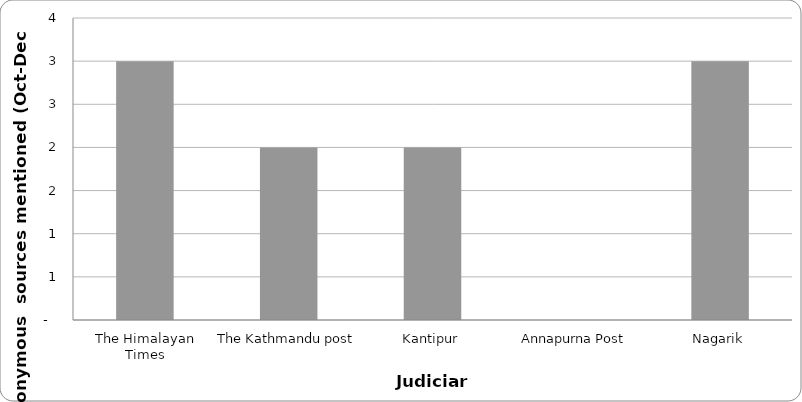
| Category | Judiciary |
|---|---|
| The Himalayan Times | 3 |
| The Kathmandu post | 2 |
| Kantipur | 2 |
| Annapurna Post | 0 |
| Nagarik | 3 |